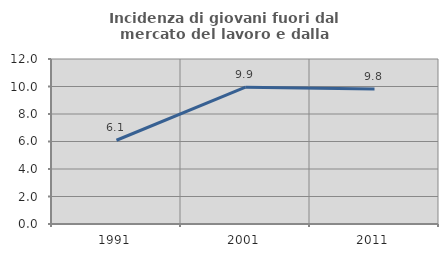
| Category | Incidenza di giovani fuori dal mercato del lavoro e dalla formazione  |
|---|---|
| 1991.0 | 6.091 |
| 2001.0 | 9.948 |
| 2011.0 | 9.813 |